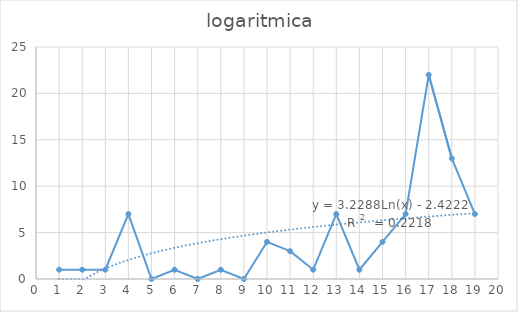
| Category | ocurrencia |
|---|---|
| 1.0 | 1 |
| 2.0 | 1 |
| 3.0 | 1 |
| 4.0 | 7 |
| 5.0 | 0 |
| 6.0 | 1 |
| 7.0 | 0 |
| 8.0 | 1 |
| 9.0 | 0 |
| 10.0 | 4 |
| 11.0 | 3 |
| 12.0 | 1 |
| 13.0 | 7 |
| 14.0 | 1 |
| 15.0 | 4 |
| 16.0 | 7 |
| 17.0 | 22 |
| 18.0 | 13 |
| 19.0 | 7 |